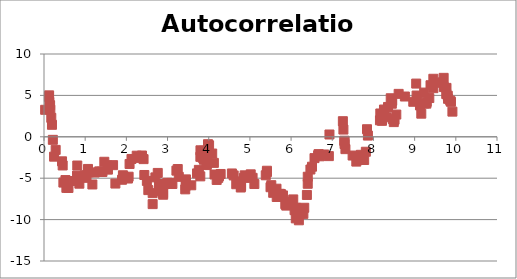
| Category | Y |
|---|---|
| 0.02777879126369953 | 3.261 |
| 0.1192385540343821 | 4.828 |
| 0.12429531430825591 | 5.005 |
| 0.12914479011669755 | 4.207 |
| 0.1481835707090795 | 3.819 |
| 0.15386939281597733 | 3.271 |
| 0.17702307552099228 | 2.288 |
| 0.19354945747181773 | 1.449 |
| 0.2148075052537024 | -0.366 |
| 0.24439220083877444 | -2.399 |
| 0.28333222260698676 | -1.58 |
| 0.4379220283590257 | -2.962 |
| 0.45358031522482634 | -3.462 |
| 0.47076640417799354 | -5.53 |
| 0.5207671062089503 | -5.226 |
| 0.5434511788189411 | -6.167 |
| 0.593867979478091 | -6.179 |
| 0.7193201268091798 | -5.34 |
| 0.8023330778814852 | -4.681 |
| 0.8078012056648731 | -3.469 |
| 0.8589938143268228 | -5.663 |
| 0.9870963077992201 | -4.645 |
| 1.0237085400149226 | -4.955 |
| 1.029978699516505 | -4.669 |
| 1.0691433073952794 | -3.883 |
| 1.087258723564446 | -4.29 |
| 1.1745919450186193 | -5.758 |
| 1.2329536187462509 | -4.317 |
| 1.3404827658087015 | -4.177 |
| 1.3928526546806097 | -4.209 |
| 1.419775621034205 | -4.241 |
| 1.464686265680939 | -3.016 |
| 1.5393903059884906 | -3.475 |
| 1.552588865160942 | -3.965 |
| 1.6773648536764085 | -3.423 |
| 1.7333660880103707 | -5.647 |
| 1.8947930098511279 | -5.188 |
| 1.9160678843036294 | -4.646 |
| 1.934179118834436 | -4.79 |
| 2.038922270294279 | -5.041 |
| 2.054681214503944 | -4.82 |
| 2.0778564270585775 | -3.283 |
| 2.1245005540549755 | -2.677 |
| 2.2512829257175326 | -2.281 |
| 2.3376880609430373 | -2.548 |
| 2.3787355492822826 | -2.26 |
| 2.4175938544794917 | -2.698 |
| 2.436551167629659 | -4.613 |
| 2.4977055657655 | -5.329 |
| 2.5330457207746804 | -6.438 |
| 2.638276284560561 | -8.131 |
| 2.6388107729144394 | -6.803 |
| 2.704540474805981 | -4.902 |
| 2.7622395125217736 | -4.364 |
| 2.7932670526206493 | -5.702 |
| 2.8054567938670516 | -6.563 |
| 2.8794643213041127 | -6.508 |
| 2.8924353304319084 | -6.8 |
| 2.893687563482672 | -6.995 |
| 2.900620906148106 | -5.814 |
| 2.985018314793706 | -5.634 |
| 3.00144825829193 | -5.548 |
| 3.093075684737414 | -5.572 |
| 3.1177438609302044 | -5.7 |
| 3.215525464620441 | -4.087 |
| 3.2477562013082206 | -3.891 |
| 3.272862182930112 | -4.835 |
| 3.4296494256705046 | -6.348 |
| 3.441185208503157 | -5.904 |
| 3.446906127501279 | -5.144 |
| 3.5756412683986127 | -5.857 |
| 3.7160924985073507 | -4.42 |
| 3.7604052922688425 | -3.993 |
| 3.795267683453858 | -4.778 |
| 3.797050784341991 | -2.421 |
| 3.7991030141711235 | -1.631 |
| 3.853939766995609 | -2.53 |
| 3.8768704258836806 | -1.69 |
| 3.883646773174405 | -2.777 |
| 3.910554728936404 | -2.144 |
| 3.947194521315396 | -3.348 |
| 3.951407433487475 | -3.416 |
| 3.966847842093557 | -2.287 |
| 3.982376034837216 | -0.892 |
| 4.008850050158799 | -1.027 |
| 4.084253963083029 | -2.021 |
| 4.125044473912567 | -3.151 |
| 4.140399491880089 | -4.551 |
| 4.193246550858021 | -5.211 |
| 4.230977965053171 | -4.962 |
| 4.248732086271048 | -4.762 |
| 4.289459784049541 | -4.489 |
| 4.562701820395887 | -4.428 |
| 4.6054727002047 | -4.666 |
| 4.668269681278616 | -5.728 |
| 4.721287006977946 | -5.387 |
| 4.778068184386939 | -6.126 |
| 4.786410611122847 | -5.952 |
| 4.855611156672239 | -4.964 |
| 4.873327079694718 | -4.653 |
| 5.019365856423974 | -4.532 |
| 5.0650366698391736 | -4.954 |
| 5.108102895319462 | -5.703 |
| 5.384929315187037 | -4.648 |
| 5.413027564063668 | -4.27 |
| 5.413187488447875 | -4.099 |
| 5.500402175821364 | -6.09 |
| 5.51951800705865 | -5.844 |
| 5.565302812028676 | -6.766 |
| 5.6456692749634385 | -6.267 |
| 5.651235764380544 | -7.27 |
| 5.728871745523065 | -6.883 |
| 5.756037966348231 | -6.927 |
| 5.8031323296017945 | -7.081 |
| 5.858995337039232 | -8.137 |
| 5.881651698146015 | -8.309 |
| 5.891441106796265 | -8.072 |
| 5.952667752280831 | -7.824 |
| 5.997489597648382 | -8.15 |
| 6.052289353683591 | -7.562 |
| 6.084930112119764 | -8.863 |
| 6.113975872285664 | -9.851 |
| 6.114962825085968 | -8.558 |
| 6.136504595633596 | -8.642 |
| 6.188921898137778 | -10.084 |
| 6.2354356166906655 | -9.278 |
| 6.251153694465756 | -9.153 |
| 6.29854392958805 | -9.308 |
| 6.319333196152002 | -8.571 |
| 6.383897191844881 | -7.024 |
| 6.404285146854818 | -5.675 |
| 6.404834857676178 | -4.824 |
| 6.469351011328399 | -3.953 |
| 6.507546342909336 | -3.612 |
| 6.568712429143488 | -2.575 |
| 6.657319399528205 | -2.247 |
| 6.666628555394709 | -2.094 |
| 6.689705052413046 | -2.168 |
| 6.692190060857683 | -2.357 |
| 6.804231675341725 | -2.136 |
| 6.916791247203946 | -2.334 |
| 6.931737866252661 | 0.279 |
| 7.2572919353842735 | 1.884 |
| 7.270568967796862 | 0.873 |
| 7.2939858003519475 | -0.471 |
| 7.296728254295886 | -0.539 |
| 7.298521245829761 | -0.873 |
| 7.319614898879081 | -1.492 |
| 7.494096893351525 | -2.263 |
| 7.583614583127201 | -2.995 |
| 7.6951952604576945 | -2.175 |
| 7.69705057842657 | -2.461 |
| 7.774261476006359 | -2.801 |
| 7.815466683823615 | -1.805 |
| 7.8436119528487325 | 0.915 |
| 7.865437830332667 | 0.148 |
| 8.158097651321441 | 1.987 |
| 8.166400846093893 | 2.818 |
| 8.193842475302517 | 2.745 |
| 8.198950926307589 | 2.068 |
| 8.207243620418012 | 1.931 |
| 8.255633355583996 | 3.294 |
| 8.26746687758714 | 3.094 |
| 8.316695149987936 | 2.359 |
| 8.353636267129332 | 3.603 |
| 8.419279910158366 | 4.656 |
| 8.446104070171714 | 3.994 |
| 8.455292761791497 | 4.353 |
| 8.471541188191622 | 2.13 |
| 8.493658788502216 | 1.775 |
| 8.512375473510474 | 2.063 |
| 8.554801775608212 | 2.686 |
| 8.611833967734128 | 5.186 |
| 8.763339577708393 | 4.865 |
| 8.967006199527532 | 4.23 |
| 9.037681671325117 | 6.427 |
| 9.047867376357317 | 4.984 |
| 9.061552423518151 | 4.481 |
| 9.129714695736766 | 3.791 |
| 9.16156001156196 | 2.793 |
| 9.231435970868915 | 5.341 |
| 9.23322606831789 | 4.023 |
| 9.284400884062052 | 4.005 |
| 9.29428176023066 | 4.222 |
| 9.356174417771399 | 4.682 |
| 9.385638474486768 | 6.228 |
| 9.454266054090112 | 7.007 |
| 9.455546783283353 | 5.874 |
| 9.572311164811254 | 6.534 |
| 9.678388915490359 | 6.563 |
| 9.704515202902257 | 7.119 |
| 9.711900691036135 | 6.004 |
| 9.767581343185157 | 5.164 |
| 9.773245153483003 | 5.909 |
| 9.805162120610476 | 4.958 |
| 9.811924130190164 | 4.584 |
| 9.864711842965335 | 4.363 |
| 9.882186462637037 | 4.223 |
| 9.91733661154285 | 3.039 |